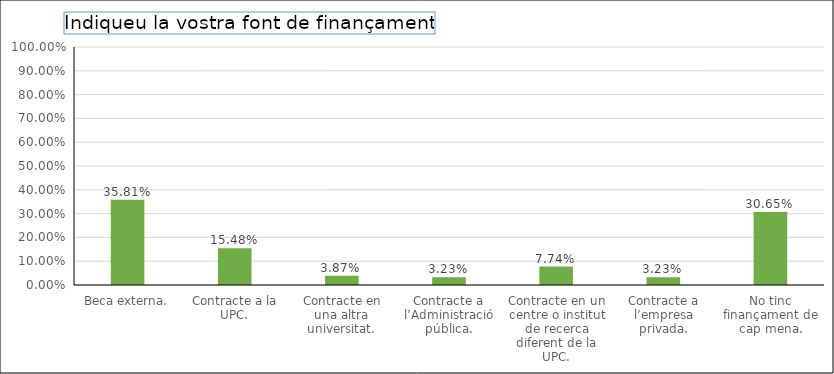
| Category | Series 0 |
|---|---|
| Beca externa. | 0.358 |
| Contracte a la UPC. | 0.155 |
| Contracte en una altra universitat. | 0.039 |
| Contracte a l’Administració pública. | 0.032 |
| Contracte en un centre o institut de recerca diferent de la UPC. | 0.077 |
| Contracte a l’empresa privada. | 0.032 |
| No tinc finançament de cap mena. | 0.306 |